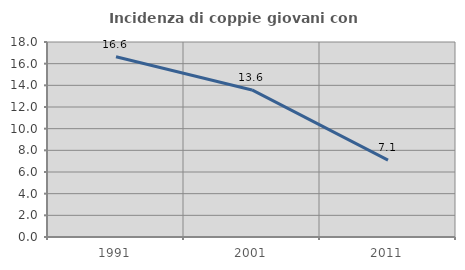
| Category | Incidenza di coppie giovani con figli |
|---|---|
| 1991.0 | 16.634 |
| 2001.0 | 13.575 |
| 2011.0 | 7.094 |